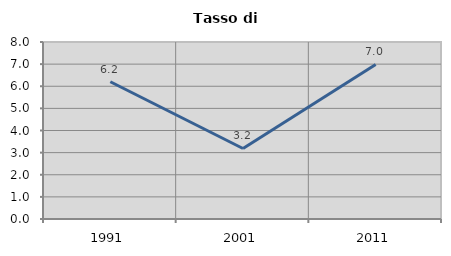
| Category | Tasso di disoccupazione   |
|---|---|
| 1991.0 | 6.203 |
| 2001.0 | 3.188 |
| 2011.0 | 6.983 |